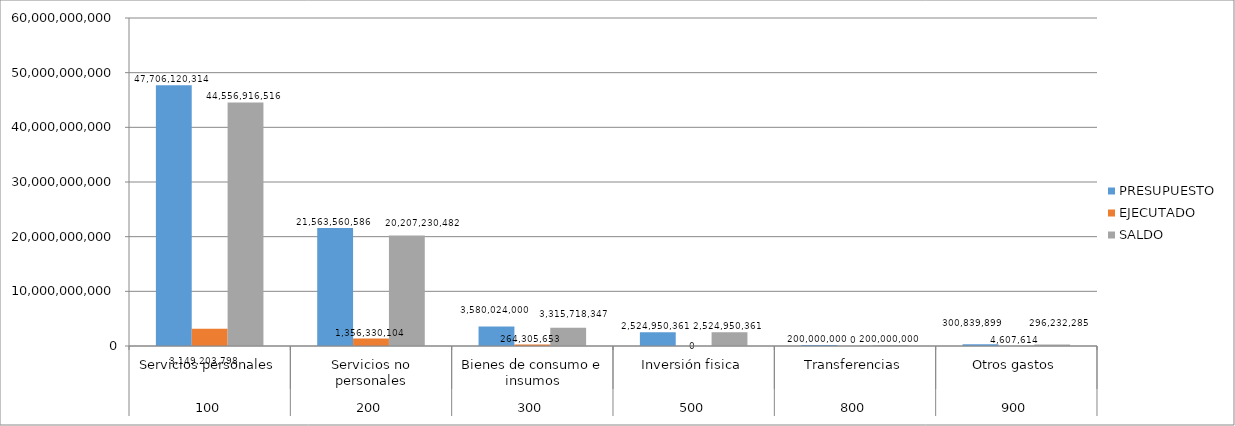
| Category | PRESUPUESTO | EJECUTADO | SALDO |
|---|---|---|---|
| 0 | 47706120314 | 3149203798 | 44556916516 |
| 1 | 21563560586 | 1356330104 | 20207230482 |
| 2 | 3580024000 | 264305653 | 3315718347 |
| 3 | 2524950361 | 0 | 2524950361 |
| 4 | 200000000 | 0 | 200000000 |
| 5 | 300839899 | 4607614 | 296232285 |